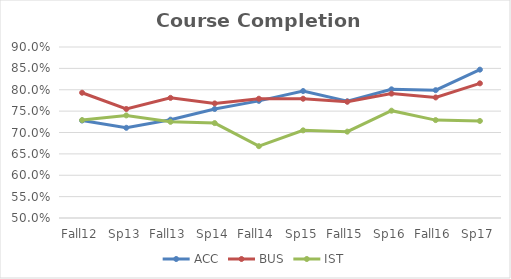
| Category | ACC | BUS | IST |
|---|---|---|---|
| Fall12 | 0.728 | 0.793 | 0.729 |
| Sp13 | 0.711 | 0.755 | 0.74 |
| Fall13 | 0.73 | 0.781 | 0.725 |
| Sp14 | 0.755 | 0.768 | 0.722 |
| Fall14 | 0.774 | 0.779 | 0.668 |
| Sp15 | 0.797 | 0.779 | 0.705 |
| Fall15 | 0.773 | 0.772 | 0.702 |
| Sp16 | 0.801 | 0.791 | 0.751 |
| Fall16 | 0.799 | 0.782 | 0.729 |
| Sp17 | 0.847 | 0.815 | 0.727 |